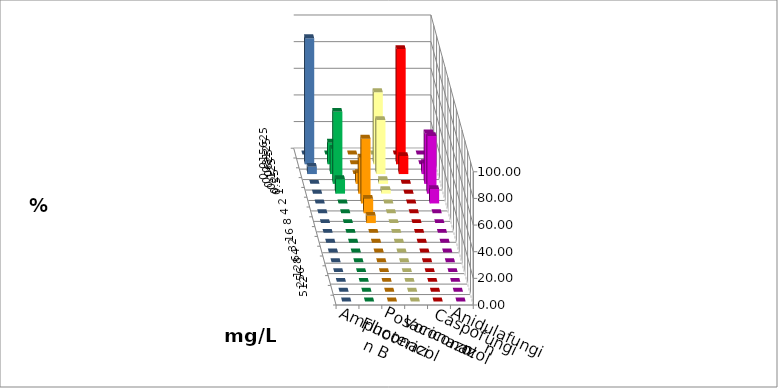
| Category | Amphotericin B | Fluconazol | Posaconazol | Voriconazol | Caspofungin | Anidulafungin |
|---|---|---|---|---|---|---|
| 0.015625 | 0 | 0 | 0 | 0 | 0 | 0 |
| 0.03125 | 16.216 | 0 | 54.054 | 86.486 | 0 | 94.595 |
| 0.0625 | 18.919 | 0 | 40.541 | 13.514 | 8.108 | 5.405 |
| 0.125 | 54.054 | 8.108 | 2.703 | 0 | 37.838 | 0 |
| 0.25 | 10.811 | 27.027 | 2.703 | 0 | 43.243 | 0 |
| 0.5 | 0 | 48.649 | 0 | 0 | 10.811 | 0 |
| 1.0 | 0 | 10.811 | 0 | 0 | 0 | 0 |
| 2.0 | 0 | 5.405 | 0 | 0 | 0 | 0 |
| 4.0 | 0 | 0 | 0 | 0 | 0 | 0 |
| 8.0 | 0 | 0 | 0 | 0 | 0 | 0 |
| 16.0 | 0 | 0 | 0 | 0 | 0 | 0 |
| 32.0 | 0 | 0 | 0 | 0 | 0 | 0 |
| 64.0 | 0 | 0 | 0 | 0 | 0 | 0 |
| 128.0 | 0 | 0 | 0 | 0 | 0 | 0 |
| 256.0 | 0 | 0 | 0 | 0 | 0 | 0 |
| 512.0 | 0 | 0 | 0 | 0 | 0 | 0 |